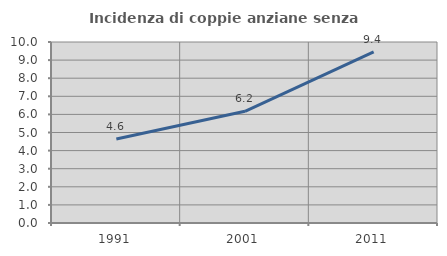
| Category | Incidenza di coppie anziane senza figli  |
|---|---|
| 1991.0 | 4.642 |
| 2001.0 | 6.17 |
| 2011.0 | 9.449 |